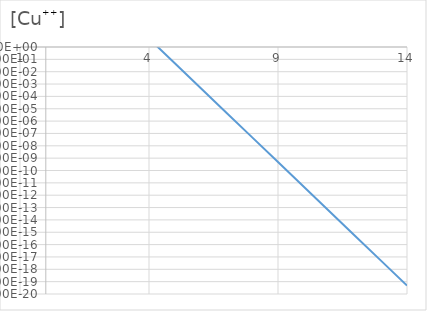
| Category |  [Cu++]  |
|---|---|
| 1.0 | 4800000 |
| 2.0 | 48000 |
| 3.0 | 480 |
| 4.0 | 4.8 |
| 5.0 | 0.048 |
| 6.0 | 0 |
| 7.0 | 0 |
| 8.0 | 0 |
| 9.0 | 0 |
| 10.0 | 0 |
| 11.0 | 0 |
| 12.0 | 0 |
| 13.0 | 0 |
| 14.0 | 0 |